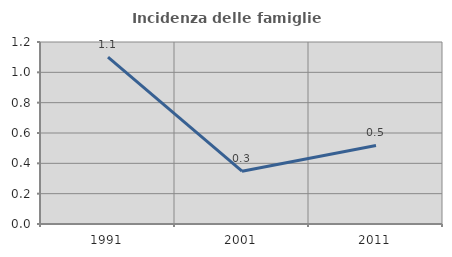
| Category | Incidenza delle famiglie numerose |
|---|---|
| 1991.0 | 1.101 |
| 2001.0 | 0.348 |
| 2011.0 | 0.518 |